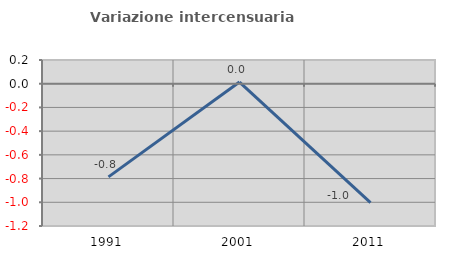
| Category | Variazione intercensuaria annua |
|---|---|
| 1991.0 | -0.786 |
| 2001.0 | 0.014 |
| 2011.0 | -1.002 |